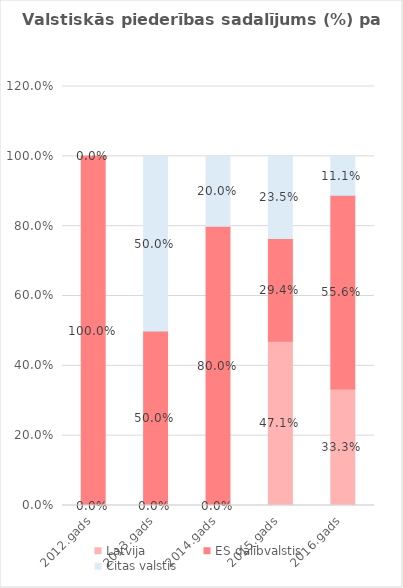
| Category | Latvija | ES dalībvalstis | Citas valstis |
|---|---|---|---|
| 2012.gads | 0 | 1 | 0 |
| 2013.gads | 0 | 0.5 | 0.5 |
| 2014.gads | 0 | 0.8 | 0.2 |
| 2015.gads | 0.471 | 0.294 | 0.235 |
| 2016.gads | 0.333 | 0.556 | 0.111 |